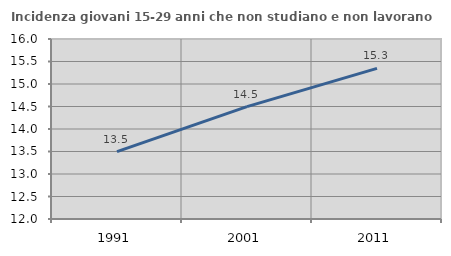
| Category | Incidenza giovani 15-29 anni che non studiano e non lavorano  |
|---|---|
| 1991.0 | 13.498 |
| 2001.0 | 14.496 |
| 2011.0 | 15.347 |